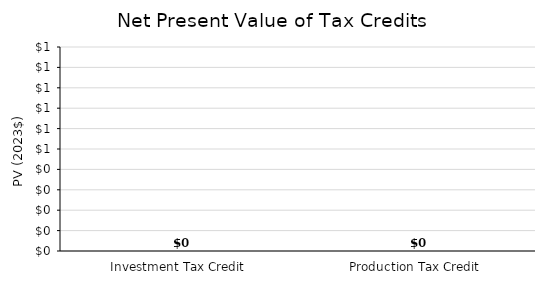
| Category | Series 0 |
|---|---|
| Investment Tax Credit | 0 |
| Production Tax Credit | 0 |